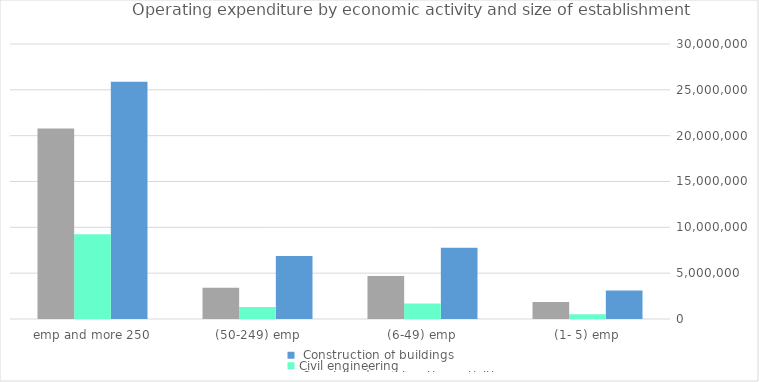
| Category |  Construction of buildings | Civil engineering |  Specialized construction activities |
|---|---|---|---|
|  (1- 5) emp  | 3106101.264 | 521079.994 | 1859310.045 |
|  (6-49) emp  | 7774855.543 | 1682884.076 | 4685218.719 |
|  (50-249) emp  | 6859586.78 | 1322150.202 | 3398477.382 |
|  emp and more 250  | 25868579.713 | 9236517.43 | 20776041.615 |